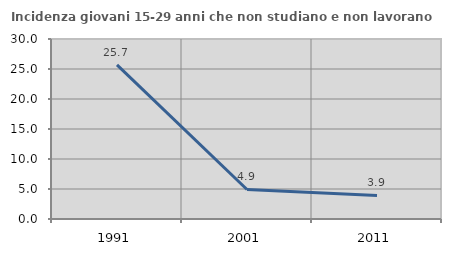
| Category | Incidenza giovani 15-29 anni che non studiano e non lavorano  |
|---|---|
| 1991.0 | 25.676 |
| 2001.0 | 4.921 |
| 2011.0 | 3.933 |